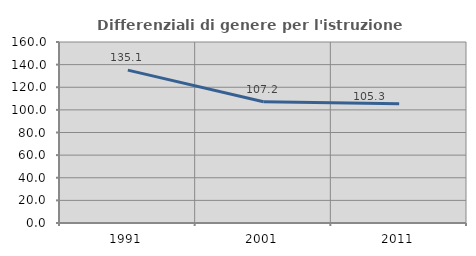
| Category | Differenziali di genere per l'istruzione superiore |
|---|---|
| 1991.0 | 135.13 |
| 2001.0 | 107.2 |
| 2011.0 | 105.335 |